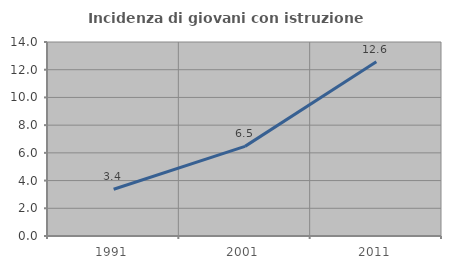
| Category | Incidenza di giovani con istruzione universitaria |
|---|---|
| 1991.0 | 3.371 |
| 2001.0 | 6.468 |
| 2011.0 | 12.568 |